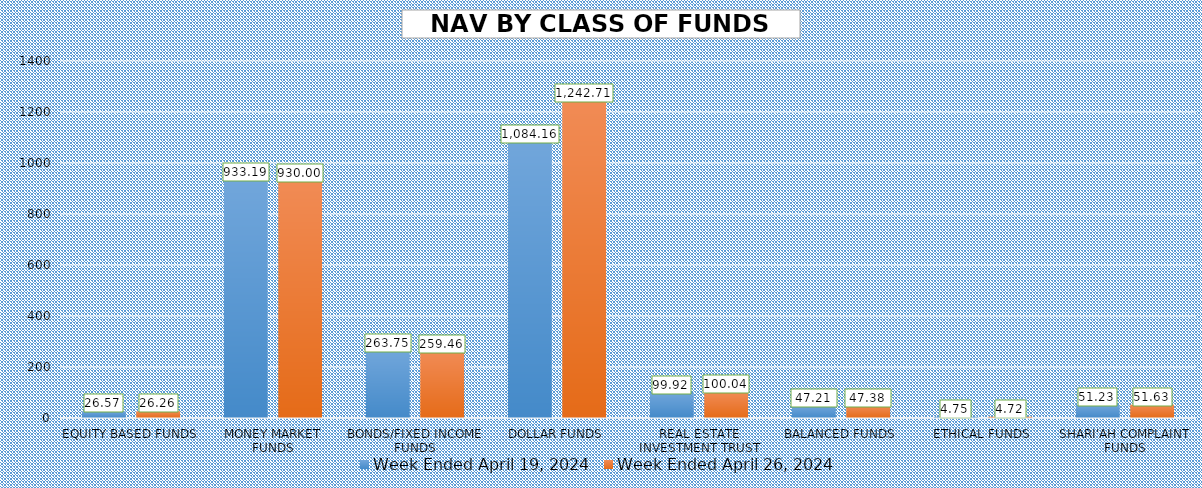
| Category | Week Ended April 19, 2024 | Week Ended April 26, 2024 |
|---|---|---|
| EQUITY BASED FUNDS | 26.572 | 26.264 |
| MONEY MARKET FUNDS | 933.193 | 929.998 |
| BONDS/FIXED INCOME FUNDS | 263.752 | 259.456 |
| DOLLAR FUNDS | 1084.164 | 1242.708 |
| REAL ESTATE INVESTMENT TRUST | 99.918 | 100.038 |
| BALANCED FUNDS | 47.214 | 47.382 |
| ETHICAL FUNDS | 4.753 | 4.723 |
| SHARI'AH COMPLAINT FUNDS | 51.232 | 51.626 |